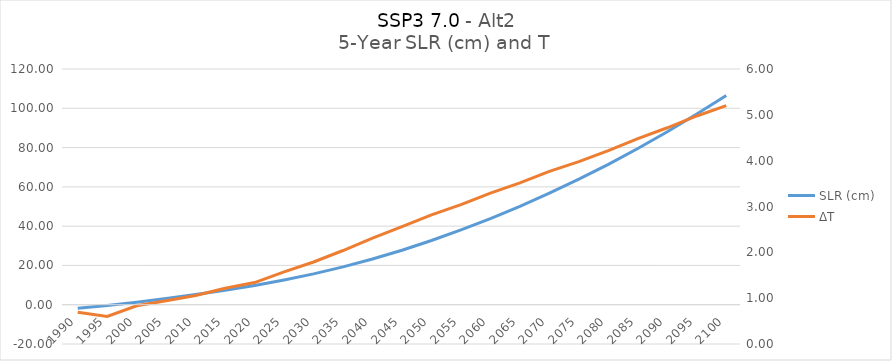
| Category | SLR (cm) |
|---|---|
| 1990.0 | -1.781 |
| 1995.0 | -0.455 |
| 2000.0 | 1.253 |
| 2005.0 | 3.132 |
| 2010.0 | 5.16 |
| 2015.0 | 7.412 |
| 2020.0 | 9.814 |
| 2025.0 | 12.59 |
| 2030.0 | 15.709 |
| 2035.0 | 19.254 |
| 2040.0 | 23.278 |
| 2045.0 | 27.752 |
| 2050.0 | 32.707 |
| 2055.0 | 38.056 |
| 2060.0 | 43.878 |
| 2065.0 | 50.106 |
| 2070.0 | 56.818 |
| 2075.0 | 63.914 |
| 2080.0 | 71.46 |
| 2085.0 | 79.522 |
| 2090.0 | 88.043 |
| 2095.0 | 97.076 |
| 2100.0 | 106.54 |